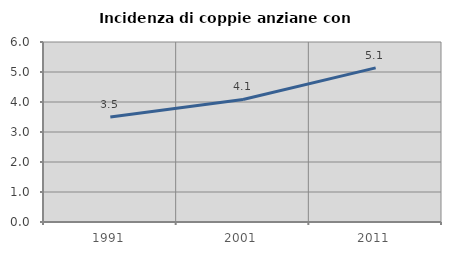
| Category | Incidenza di coppie anziane con figli |
|---|---|
| 1991.0 | 3.499 |
| 2001.0 | 4.084 |
| 2011.0 | 5.138 |